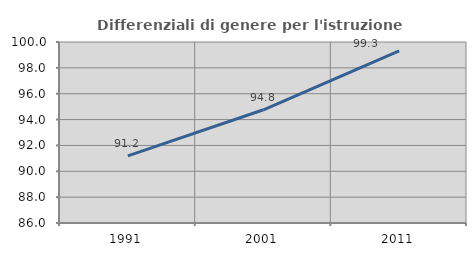
| Category | Differenziali di genere per l'istruzione superiore |
|---|---|
| 1991.0 | 91.192 |
| 2001.0 | 94.758 |
| 2011.0 | 99.316 |